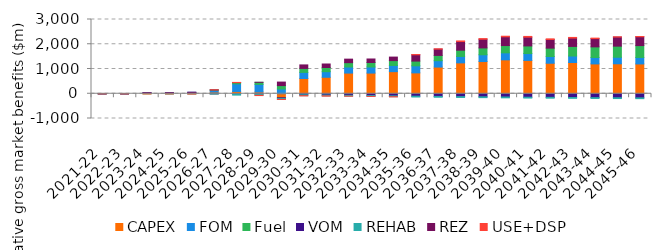
| Category | CAPEX | FOM | Fuel | VOM | REHAB | REZ | USE+DSP |
|---|---|---|---|---|---|---|---|
| 2021-22 | 0.016 | 0.001 | 0.006 | 0.001 | 0 | 0 | 0.001 |
| 2022-23 | 0.043 | 0.009 | 0.013 | 0.003 | 0 | 0.002 | 0.002 |
| 2023-24 | 24.853 | 12.51 | -0.739 | 0.205 | 0 | 0.003 | -1.31 |
| 2024-25 | 24.87 | 13.217 | -1.607 | 0.404 | -0.044 | 0.003 | -1.435 |
| 2025-26 | 39.899 | 16.818 | -0.012 | 0.823 | -0.639 | 0.003 | -8.388 |
| 2026-27 | 68.95 | 74.018 | 11.82 | -2.861 | -8.217 | 0.003 | 2.715 |
| 2027-28 | 92.122 | 309.289 | 49.773 | -6.925 | -48.111 | 0.004 | 6.818 |
| 2028-29 | 71.816 | 307.472 | 83.208 | -15.727 | -48.111 | 0.005 | -9.605 |
| 2029-30 | -159.517 | 191.314 | 138.065 | -25.949 | -42.031 | 142.058 | -4.678 |
| 2030-31 | 616.864 | 246.018 | 160.144 | -40.4 | -37.487 | 142.059 | -8.358 |
| 2031-32 | 666.159 | 225.263 | 168.517 | -52.762 | -32.963 | 142.059 | -10.652 |
| 2032-33 | 835.257 | 245.641 | 175.237 | -63.717 | -32.963 | 142.059 | -1.444 |
| 2033-34 | 835.258 | 245.641 | 181.428 | -73.284 | -32.963 | 142.059 | -1.08 |
| 2034-35 | 892.684 | 250.34 | 196.09 | -86.614 | -32.963 | 142.059 | -6.05 |
| 2035-36 | 843.281 | 284.48 | 192.181 | -98.454 | -32.963 | 254.549 | 9.667 |
| 2036-37 | 1078.312 | 257.1 | 213.461 | -108.252 | -32.963 | 254.549 | 11.259 |
| 2037-38 | 1247.523 | 259.549 | 252.884 | -116.156 | -32.963 | 349.757 | 23.791 |
| 2038-39 | 1301.325 | 273.678 | 276.93 | -123.974 | -32.963 | 351.823 | 23.761 |
| 2039-40 | 1369.427 | 283.393 | 294.547 | -132.06 | -32.963 | 354.458 | 22.514 |
| 2040-41 | 1347.243 | 277.179 | 307.949 | -140.493 | -32.963 | 354.458 | 29.485 |
| 2041-42 | 1233.245 | 271.401 | 338.623 | -145.615 | -32.963 | 350.486 | 23.151 |
| 2042-43 | 1261.552 | 263.335 | 387.297 | -151.745 | -32.963 | 337.292 | 26.235 |
| 2043-44 | 1206.233 | 258.404 | 429.832 | -156.537 | -32.963 | 334.333 | 18.37 |
| 2044-45 | 1211.262 | 263.915 | 447.866 | -160.928 | -32.963 | 367.465 | 8.221 |
| 2045-46 | 1204.658 | 261.911 | 479.254 | -165.396 | -32.963 | 356.746 | 9.581 |